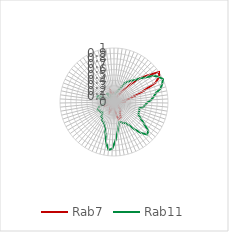
| Category | Rab7 | Rab11 |
|---|---|---|
| 0.0 | 0.144 | 0.1 |
| 0.10913 | 0.142 | 0.119 |
| 0.21825 | 0.115 | 0.168 |
| 0.32738 | 0.077 | 0.169 |
| 0.43651 | 0.084 | 0.207 |
| 0.54563 | 0.106 | 0.248 |
| 0.65476 | 0.062 | 0.301 |
| 0.76389 | 0.11 | 0.412 |
| 0.87302 | 0.201 | 0.461 |
| 0.98214 | 0.301 | 0.511 |
| 1.09127 | 0.467 | 0.558 |
| 1.2004 | 0.655 | 0.652 |
| 1.30952 | 0.812 | 0.739 |
| 1.41865 | 1 | 0.878 |
| 1.52778 | 0.961 | 0.953 |
| 1.6369 | 0.849 | 1 |
| 1.74603 | 0.581 | 0.953 |
| 1.85516 | 0.397 | 0.901 |
| 1.96429 | 0.279 | 0.789 |
| 2.07341 | 0.187 | 0.742 |
| 2.18254 | 0.22 | 0.689 |
| 2.29167 | 0.129 | 0.617 |
| 2.40079 | 0.111 | 0.577 |
| 2.50992 | 0.1 | 0.554 |
| 2.61905 | 0.08 | 0.482 |
| 2.72817 | 0.033 | 0.496 |
| 2.8373 | 0.098 | 0.497 |
| 2.94643 | 0.053 | 0.509 |
| 3.05556 | 0.035 | 0.575 |
| 3.16468 | 0.082 | 0.684 |
| 3.27381 | 0.099 | 0.829 |
| 3.38294 | 0.113 | 0.859 |
| 3.49206 | 0.169 | 0.764 |
| 3.60119 | 0.199 | 0.632 |
| 3.71032 | 0.206 | 0.504 |
| 3.81944 | 0.223 | 0.437 |
| 3.92857 | 0.305 | 0.429 |
| 4.0377 | 0.312 | 0.391 |
| 4.14683 | 0.326 | 0.383 |
| 4.25595 | 0.256 | 0.447 |
| 4.36508 | 0.162 | 0.563 |
| 4.47421 | 0.117 | 0.714 |
| 4.58333 | 0.1 | 0.869 |
| 4.69246 | 0.04 | 0.89 |
| 4.80159 | 0.047 | 0.772 |
| 4.91071 | 0.092 | 0.606 |
| 5.01984 | 0.147 | 0.497 |
| 5.12897 | 0.193 | 0.445 |
| 5.2381 | 0.181 | 0.416 |
| 5.34722 | 0.141 | 0.413 |
| 5.45635 | 0.133 | 0.362 |
| 5.56548 | 0.088 | 0.359 |
| 5.6746 | 0.046 | 0.298 |
| 5.78373 | 0.031 | 0.281 |
| 5.89286 | 0.01 | 0.318 |
| 6.00198 | 0 | 0.303 |
| 6.11111 | 0.088 | 0.34 |
| 6.22024 | 0.159 | 0.325 |
| 6.32937 | 0.136 | 0.299 |
| 6.43849 | 0.129 | 0.232 |
| 6.54762 | 0.097 | 0.189 |
| 6.65675 | 0.117 | 0.162 |
| 6.76587 | 0.138 | 0.138 |
| 6.875 | 0.106 | 0.155 |
| 6.98413 | 0.108 | 0.205 |
| 7.09325 | 0.137 | 0.258 |
| 7.20238 | 0.109 | 0.319 |
| 7.31151 | 0.125 | 0.323 |
| 7.42063 | 0.026 | 0.233 |
| 7.52976 | 0.032 | 0.095 |
| 7.63889 | 0.041 | 0.022 |
| 7.74802 | 0.052 | 0 |
| 7.85714 | 0.022 | 0.062 |
| 7.96627 | 0.075 | 0.129 |
| 8.0754 | 0.076 | 0.21 |
| 8.18452 | 0.092 | 0.208 |
| 8.29365 | 0.13 | 0.137 |
| 8.40278 | 0.126 | 0.148 |
| 8.5119 | 0.162 | 0.145 |
| 8.62103 | 0.212 | 0.122 |
| 8.73016 | 0.171 | 0.097 |
| 8.83929 | 0.173 | 0.124 |
| 8.94841 | 0.172 | 0.121 |